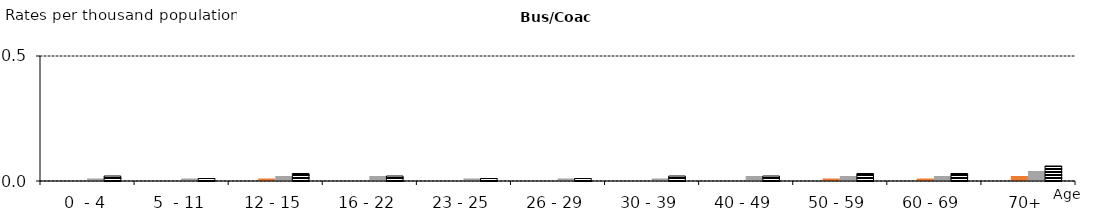
| Category | Killed | Adjusted serious | Adjusted slight | All Severities |
|---|---|---|---|---|
| 0  - 4 | 0 | 0 | 0.01 | 0.02 |
| 5  - 11 | 0 | 0 | 0.01 | 0.01 |
| 12 - 15 | 0 | 0.01 | 0.02 | 0.03 |
| 16 - 22 | 0 | 0 | 0.02 | 0.02 |
| 23 - 25 | 0 | 0 | 0.01 | 0.01 |
| 26 - 29 | 0 | 0 | 0.01 | 0.01 |
| 30 - 39 | 0 | 0 | 0.01 | 0.02 |
| 40 - 49 | 0 | 0 | 0.02 | 0.02 |
| 50 - 59 | 0 | 0.01 | 0.02 | 0.03 |
| 60 - 69 | 0 | 0.01 | 0.02 | 0.03 |
| 70+ | 0 | 0.02 | 0.04 | 0.06 |